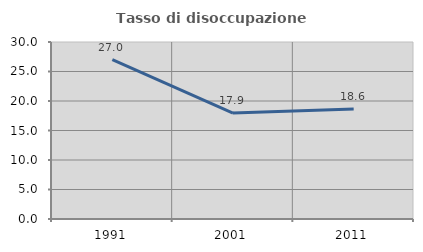
| Category | Tasso di disoccupazione giovanile  |
|---|---|
| 1991.0 | 27.007 |
| 2001.0 | 17.949 |
| 2011.0 | 18.644 |